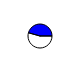
| Category | Series 0 |
|---|---|
| 0 | 21783 |
| 1 | 18290 |